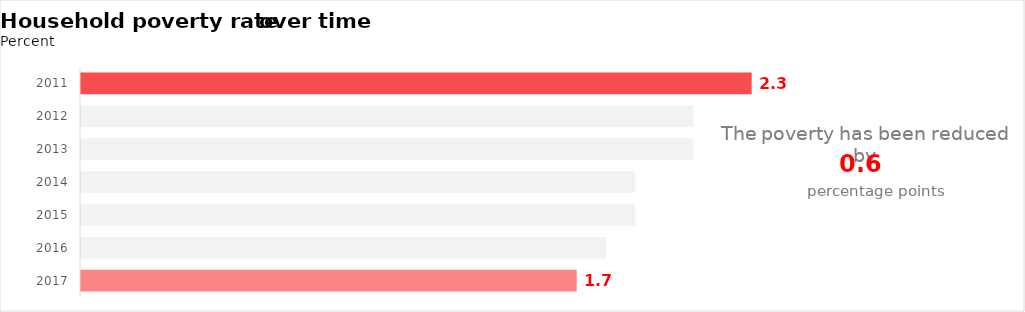
| Category |  Bumthang  |
|---|---|
| 2011 | 2.3 |
| 2012 | 2.1 |
| 2013 | 2.1 |
| 2014 | 1.9 |
| 2015 | 1.9 |
| 2016 | 1.8 |
| 2017 | 1.7 |